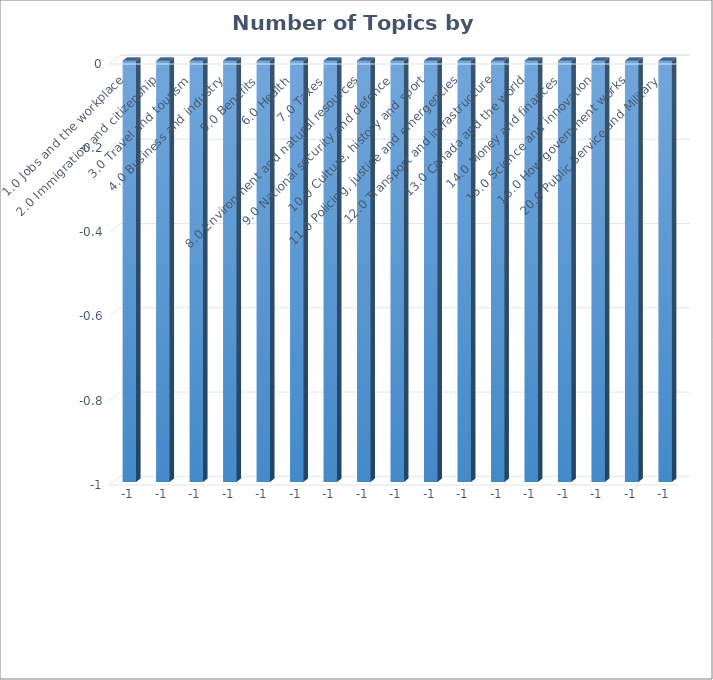
| Category | Series 0 |
|---|---|
| 1.0 Jobs and the workplace | -1 |
| 2.0 Immigration and citizenship | -1 |
| 3.0 Travel and tourism | -1 |
| 4.0 Business and industry | -1 |
| 5.0 Benefits | -1 |
| 6.0 Health | -1 |
| 7.0 Taxes | -1 |
| 8.0 Environment and natural resources | -1 |
| 9.0 National security and defence | -1 |
| 10.0 Culture, history and sport | -1 |
| 11.0 Policing, justice and emergencies | -1 |
| 12.0 Transport and infrastructure | -1 |
| 13.0 Canada and the world | -1 |
| 14.0 Money and finances | -1 |
| 15.0 Science and innovation | -1 |
| 16.0 How government works | -1 |
| 20.0 Public Service and Military | -1 |